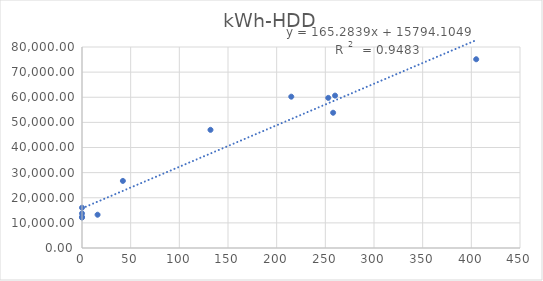
| Category | Series 0 |
|---|---|
| 405.0 | 75122.544 |
| 258.0 | 53832.555 |
| 253.0 | 59750.25 |
| 132.0 | 47027.925 |
| 42.0 | 26699.666 |
| 0.0 | 16031.75 |
| 0.0 | 12369.735 |
| 0.0 | 13774.95 |
| 0.0 | 12110.49 |
| 16.0 | 13242.285 |
| 260.0 | 60653.6 |
| 215.0 | 60227.398 |